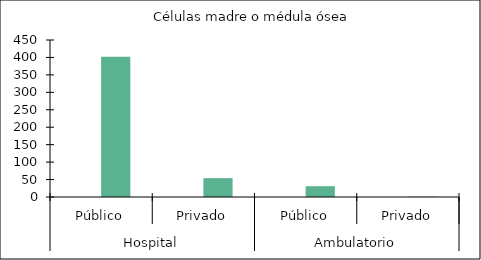
| Category |   |    Células madre o médula ósea |
|---|---|---|
| 0 | 0 | 402 |
| 1 | 0 | 54 |
| 2 | 0 | 31 |
| 3 | 0 | 1 |